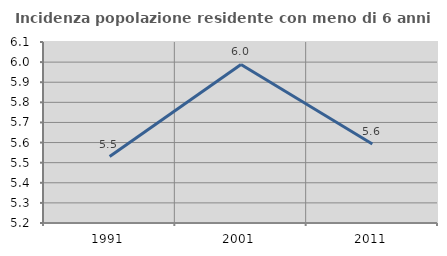
| Category | Incidenza popolazione residente con meno di 6 anni |
|---|---|
| 1991.0 | 5.531 |
| 2001.0 | 5.988 |
| 2011.0 | 5.593 |